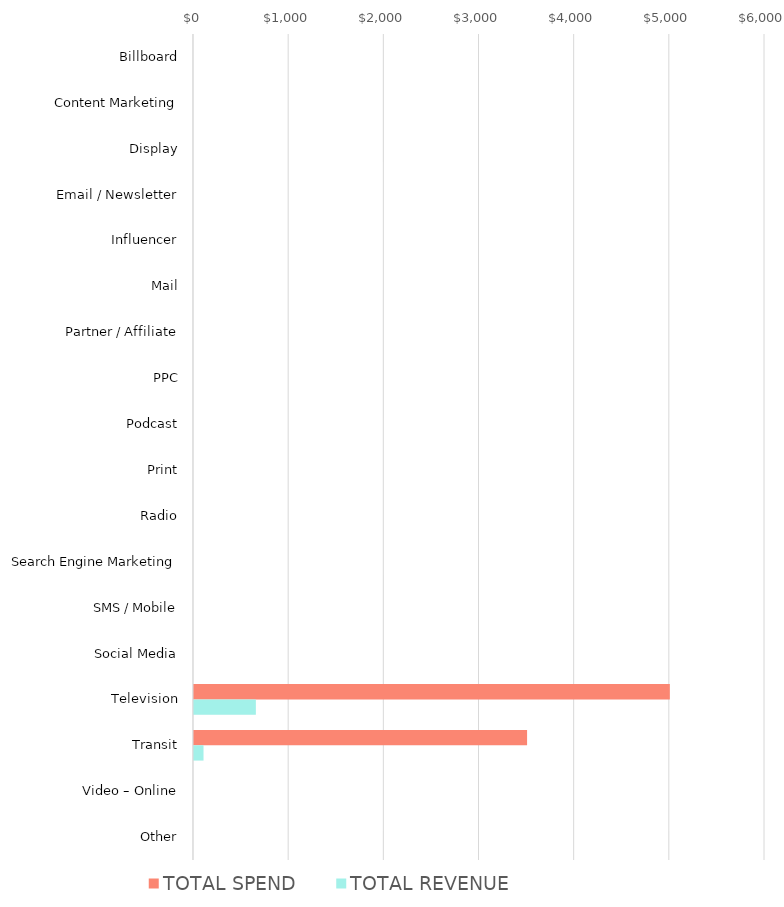
| Category | TOTAL SPEND | TOTAL REVENUE |
|---|---|---|
| Billboard | 0 | 0 |
| Content Marketing | 0 | 0 |
| Display | 0 | 0 |
| Email / Newsletter | 0 | 0 |
| Influencer | 0 | 0 |
| Mail | 0 | 0 |
| Partner / Affiliate | 0 | 0 |
| PPC | 0 | 0 |
| Podcast | 0 | 0 |
| Print | 0 | 0 |
| Radio | 0 | 0 |
| Search Engine Marketing | 0 | 0 |
| SMS / Mobile | 0 | 0 |
| Social Media | 0 | 0 |
| Television | 5000 | 650 |
| Transit | 3500 | 100 |
| Video – Online | 0 | 0 |
| Other | 0 | 0 |